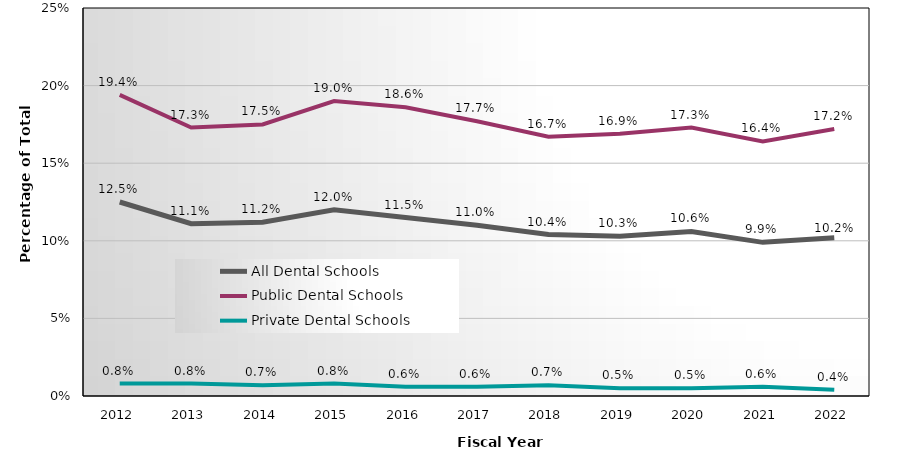
| Category | All Dental Schools | Public Dental Schools | Private Dental Schools |
|---|---|---|---|
| 2012.0 | 0.125 | 0.194 | 0.008 |
| 2013.0 | 0.111 | 0.173 | 0.008 |
| 2014.0 | 0.112 | 0.175 | 0.007 |
| 2015.0 | 0.12 | 0.19 | 0.008 |
| 2016.0 | 0.115 | 0.186 | 0.006 |
| 2017.0 | 0.11 | 0.177 | 0.006 |
| 2018.0 | 0.104 | 0.167 | 0.007 |
| 2019.0 | 0.103 | 0.169 | 0.005 |
| 2020.0 | 0.106 | 0.173 | 0.005 |
| 2021.0 | 0.099 | 0.164 | 0.006 |
| 2022.0 | 0.102 | 0.172 | 0.004 |